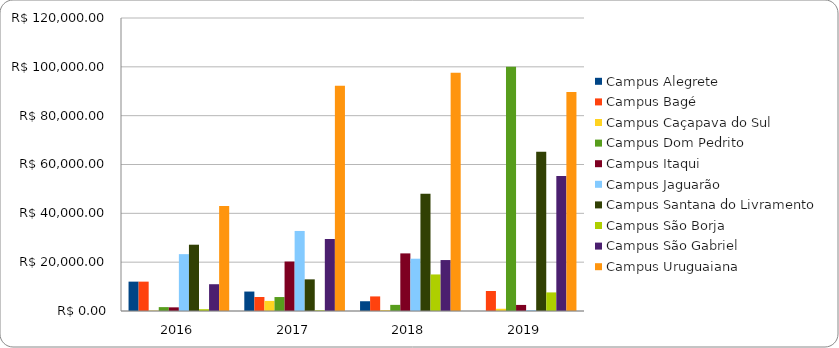
| Category | Campus Alegrete | Campus Bagé | Campus Caçapava do Sul | Campus Dom Pedrito | Campus Itaqui | Campus Jaguarão | Campus Santana do Livramento | Campus São Borja | Campus São Gabriel | Campus Uruguaiana |
|---|---|---|---|---|---|---|---|---|---|---|
| 2016.0 | 12026.67 | 12026.67 | 171.6 | 1591.45 | 1495 | 23283.82 | 27150.52 | 729.45 | 10967.1 | 42986.75 |
| 2017.0 | 7964.92 | 5746.14 | 4135.08 | 5718.77 | 20261.18 | 32781.69 | 12959.88 | 276.01 | 29495.6 | 92203.55 |
| 2018.0 | 3998.74 | 5972.48 | 344.88 | 2511.35 | 23593.68 | 21420.1 | 48063.61 | 14969.8 | 20865.3 | 97616.88 |
| 2019.0 | 0 | 8187.29 | 923.25 | 100029.15 | 2485.98 | 326.06 | 65187.39 | 7612.98 | 55325.32 | 89685.04 |